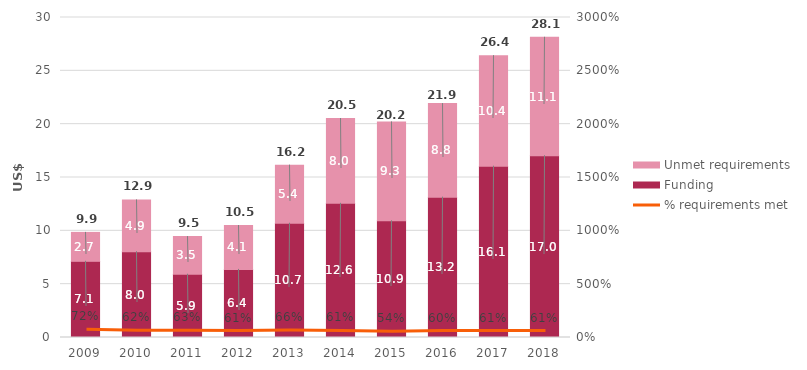
| Category | Funding | Unmet requirements |
|---|---|---|
| 2009.0 | 7.143 | 2.711 |
| 2010.0 | 8.044 | 4.856 |
| 2011.0 | 5.931 | 3.529 |
| 2012.0 | 6.384 | 4.112 |
| 2013.0 | 10.712 | 5.448 |
| 2014.0 | 12.58 | 7.951 |
| 2015.0 | 10.942 | 9.27 |
| 2016.0 | 13.159 | 8.767 |
| 2017.0 | 16.061 | 10.361 |
| 2018.0 | 17.038 | 11.109 |